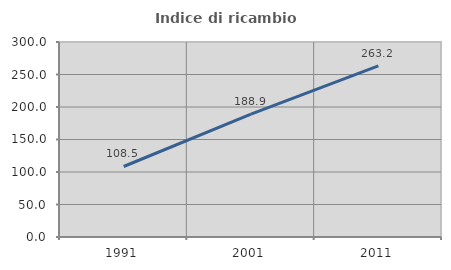
| Category | Indice di ricambio occupazionale  |
|---|---|
| 1991.0 | 108.475 |
| 2001.0 | 188.889 |
| 2011.0 | 263.158 |